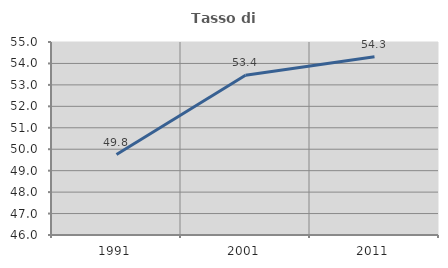
| Category | Tasso di occupazione   |
|---|---|
| 1991.0 | 49.754 |
| 2001.0 | 53.448 |
| 2011.0 | 54.31 |